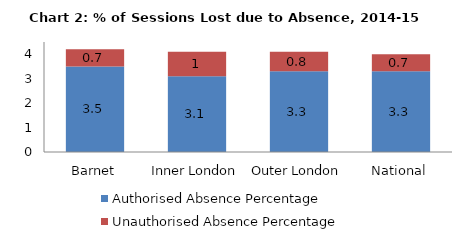
| Category | Authorised Absence Percentage | Unauthorised Absence Percentage |
|---|---|---|
| Barnet | 3.5 | 0.7 |
| Inner London | 3.1 | 1 |
| Outer London | 3.3 | 0.8 |
| National | 3.3 | 0.7 |